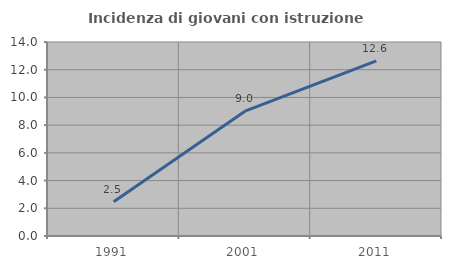
| Category | Incidenza di giovani con istruzione universitaria |
|---|---|
| 1991.0 | 2.471 |
| 2001.0 | 9.008 |
| 2011.0 | 12.642 |